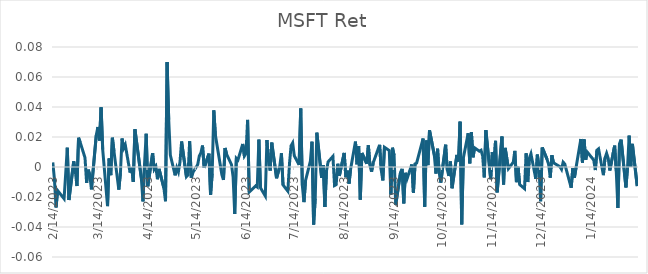
| Category | MSFT Ret |
|---|---|
| 2/14/23 | 0.003 |
| 2/15/23 | -0.008 |
| 2/16/23 | -0.027 |
| 2/17/23 | -0.016 |
| 2/21/23 | -0.021 |
| 2/22/23 | -0.005 |
| 2/23/23 | 0.013 |
| 2/24/23 | -0.022 |
| 2/27/23 | 0.004 |
| 2/28/23 | -0.003 |
| 3/1/23 | -0.013 |
| 3/2/23 | 0.019 |
| 3/3/23 | 0.017 |
| 3/6/23 | 0.006 |
| 3/7/23 | -0.011 |
| 3/8/23 | -0.002 |
| 3/9/23 | -0.005 |
| 3/10/23 | -0.015 |
| 3/13/23 | 0.021 |
| 3/14/23 | 0.027 |
| 3/15/23 | 0.018 |
| 3/16/23 | 0.04 |
| 3/17/23 | 0.012 |
| 3/20/23 | -0.026 |
| 3/21/23 | 0.006 |
| 3/22/23 | -0.005 |
| 3/23/23 | 0.02 |
| 3/24/23 | 0.01 |
| 3/27/23 | -0.015 |
| 3/28/23 | -0.004 |
| 3/29/23 | 0.019 |
| 3/30/23 | 0.013 |
| 3/31/23 | 0.015 |
| 4/3/23 | -0.004 |
| 4/4/23 | 0 |
| 4/5/23 | -0.01 |
| 4/6/23 | 0.025 |
| 4/10/23 | -0.008 |
| 4/11/23 | -0.023 |
| 4/12/23 | 0.002 |
| 4/13/23 | 0.022 |
| 4/14/23 | -0.013 |
| 4/17/23 | 0.009 |
| 4/18/23 | -0.001 |
| 4/19/23 | 0 |
| 4/20/23 | -0.008 |
| 4/21/23 | -0.001 |
| 4/24/23 | -0.014 |
| 4/25/23 | -0.023 |
| 4/26/23 | 0.07 |
| 4/27/23 | 0.032 |
| 4/28/23 | 0.008 |
| 5/1/23 | -0.006 |
| 5/2/23 | 0 |
| 5/3/23 | -0.003 |
| 5/4/23 | 0.003 |
| 5/5/23 | 0.017 |
| 5/8/23 | -0.006 |
| 5/9/23 | -0.005 |
| 5/10/23 | 0.017 |
| 5/11/23 | -0.007 |
| 5/12/23 | -0.004 |
| 5/15/23 | 0.002 |
| 5/16/23 | 0.007 |
| 5/17/23 | 0.009 |
| 5/18/23 | 0.014 |
| 5/19/23 | -0.001 |
| 5/22/23 | 0.009 |
| 5/23/23 | -0.019 |
| 5/24/23 | -0.004 |
| 5/25/23 | 0.038 |
| 5/26/23 | 0.021 |
| 5/30/23 | -0.005 |
| 5/31/23 | -0.009 |
| 6/1/23 | 0.013 |
| 6/2/23 | 0.008 |
| 6/5/23 | 0.002 |
| 6/6/23 | -0.007 |
| 6/7/23 | -0.031 |
| 6/8/23 | 0.006 |
| 6/9/23 | 0.005 |
| 6/12/23 | 0.015 |
| 6/13/23 | 0.007 |
| 6/14/23 | 0.009 |
| 6/15/23 | 0.031 |
| 6/16/23 | -0.017 |
| 6/20/23 | -0.013 |
| 6/21/23 | -0.013 |
| 6/22/23 | 0.018 |
| 6/23/23 | -0.014 |
| 6/26/23 | -0.019 |
| 6/27/23 | 0.018 |
| 6/28/23 | 0.004 |
| 6/29/23 | -0.002 |
| 6/30/23 | 0.016 |
| 7/3/23 | -0.008 |
| 7/5/23 | 0 |
| 7/6/23 | 0.009 |
| 7/7/23 | -0.012 |
| 7/10/23 | -0.016 |
| 7/11/23 | 0.002 |
| 7/12/23 | 0.014 |
| 7/13/23 | 0.016 |
| 7/14/23 | 0.008 |
| 7/17/23 | 0.001 |
| 7/18/23 | 0.039 |
| 7/19/23 | -0.012 |
| 7/20/23 | -0.023 |
| 7/21/23 | -0.009 |
| 7/24/23 | 0.004 |
| 7/25/23 | 0.017 |
| 7/26/23 | -0.038 |
| 7/27/23 | -0.021 |
| 7/28/23 | 0.023 |
| 7/31/23 | -0.007 |
| 8/1/23 | 0.001 |
| 8/2/23 | -0.027 |
| 8/3/23 | -0.003 |
| 8/4/23 | 0.003 |
| 8/7/23 | 0.007 |
| 8/8/23 | -0.012 |
| 8/9/23 | -0.012 |
| 8/10/23 | 0.002 |
| 8/11/23 | -0.006 |
| 8/14/23 | 0.009 |
| 8/15/23 | -0.007 |
| 8/16/23 | -0.002 |
| 8/17/23 | -0.011 |
| 8/18/23 | -0.001 |
| 8/21/23 | 0.017 |
| 8/22/23 | 0.002 |
| 8/23/23 | 0.014 |
| 8/24/23 | -0.022 |
| 8/25/23 | 0.009 |
| 8/28/23 | 0.002 |
| 8/29/23 | 0.014 |
| 8/30/23 | 0.001 |
| 8/31/23 | -0.003 |
| 9/1/23 | 0.003 |
| 9/5/23 | 0.015 |
| 9/6/23 | -0.002 |
| 9/7/23 | -0.009 |
| 9/8/23 | 0.013 |
| 9/11/23 | 0.011 |
| 9/12/23 | -0.018 |
| 9/13/23 | 0.013 |
| 9/14/23 | 0.008 |
| 9/15/23 | -0.025 |
| 9/18/23 | -0.004 |
| 9/19/23 | -0.001 |
| 9/20/23 | -0.024 |
| 9/21/23 | -0.004 |
| 9/22/23 | -0.008 |
| 9/25/23 | 0.002 |
| 9/26/23 | -0.017 |
| 9/27/23 | 0.002 |
| 9/28/23 | 0.003 |
| 9/29/23 | 0.007 |
| 10/2/23 | 0.019 |
| 10/3/23 | -0.026 |
| 10/4/23 | 0.018 |
| 10/5/23 | 0.001 |
| 10/6/23 | 0.024 |
| 10/9/23 | 0.008 |
| 10/10/23 | -0.004 |
| 10/11/23 | 0.012 |
| 10/12/23 | -0.004 |
| 10/13/23 | -0.01 |
| 10/16/23 | 0.015 |
| 10/17/23 | -0.002 |
| 10/18/23 | -0.006 |
| 10/19/23 | 0.004 |
| 10/20/23 | -0.014 |
| 10/23/23 | 0.008 |
| 10/24/23 | 0.004 |
| 10/25/23 | 0.03 |
| 10/26/23 | -0.038 |
| 10/27/23 | 0.006 |
| 10/30/23 | 0.022 |
| 10/31/23 | 0.002 |
| 11/1/23 | 0.023 |
| 11/2/23 | 0.006 |
| 11/3/23 | 0.013 |
| 11/6/23 | 0.011 |
| 11/7/23 | 0.011 |
| 11/8/23 | 0.007 |
| 11/9/23 | -0.007 |
| 11/10/23 | 0.025 |
| 11/13/23 | -0.008 |
| 11/14/23 | 0.01 |
| 11/15/23 | 0 |
| 11/16/23 | 0.017 |
| 11/17/23 | -0.017 |
| 11/20/23 | 0.02 |
| 11/21/23 | -0.012 |
| 11/22/23 | 0.013 |
| 11/24/23 | -0.001 |
| 11/27/23 | 0.003 |
| 11/28/23 | 0.011 |
| 11/29/23 | -0.01 |
| 11/30/23 | 0 |
| 12/1/23 | -0.012 |
| 12/4/23 | -0.014 |
| 12/5/23 | 0.009 |
| 12/6/23 | -0.01 |
| 12/7/23 | 0.006 |
| 12/8/23 | 0.009 |
| 12/11/23 | -0.008 |
| 12/12/23 | 0.008 |
| 12/13/23 | 0 |
| 12/14/23 | -0.023 |
| 12/15/23 | 0.013 |
| 12/18/23 | 0.005 |
| 12/19/23 | 0.002 |
| 12/20/23 | -0.007 |
| 12/21/23 | 0.008 |
| 12/22/23 | 0.003 |
| 12/26/23 | 0 |
| 12/27/23 | -0.002 |
| 12/28/23 | 0.003 |
| 12/29/23 | 0.002 |
| 1/2/24 | -0.014 |
| 1/3/24 | -0.001 |
| 1/4/24 | -0.007 |
| 1/5/24 | -0.001 |
| 1/8/24 | 0.019 |
| 1/9/24 | 0.003 |
| 1/10/24 | 0.018 |
| 1/11/24 | 0.005 |
| 1/12/24 | 0.01 |
| 1/16/24 | 0.005 |
| 1/17/24 | -0.002 |
| 1/18/24 | 0.011 |
| 1/19/24 | 0.012 |
| 1/22/24 | -0.005 |
| 1/23/24 | 0.006 |
| 1/24/24 | 0.009 |
| 1/25/24 | 0.006 |
| 1/26/24 | -0.002 |
| 1/29/24 | 0.014 |
| 1/30/24 | -0.003 |
| 1/31/24 | -0.027 |
| 2/1/24 | 0.015 |
| 2/2/24 | 0.018 |
| 2/5/24 | -0.014 |
| 2/6/24 | 0 |
| 2/7/24 | 0.021 |
| 2/8/24 | 0 |
| 2/9/24 | 0.015 |
| 2/12/24 | -0.013 |